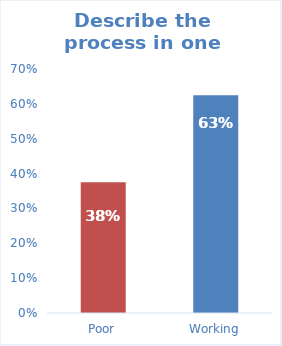
| Category | Series 0 |
|---|---|
| Poor | 0.375 |
| Working | 0.625 |